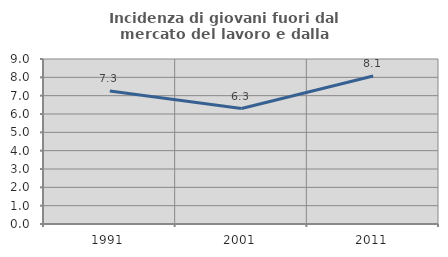
| Category | Incidenza di giovani fuori dal mercato del lavoro e dalla formazione  |
|---|---|
| 1991.0 | 7.256 |
| 2001.0 | 6.3 |
| 2011.0 | 8.075 |